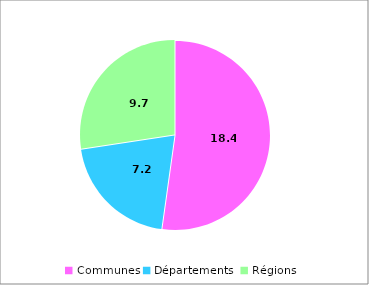
| Category | 2014p |
|---|---|
| Communes | 18.4 |
| Départements  | 7.18 |
| Régions | 9.66 |